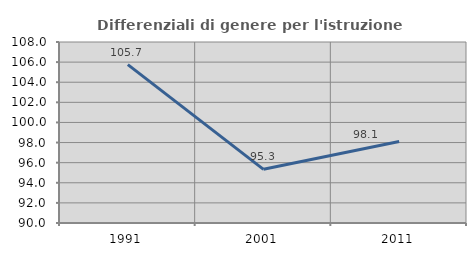
| Category | Differenziali di genere per l'istruzione superiore |
|---|---|
| 1991.0 | 105.745 |
| 2001.0 | 95.337 |
| 2011.0 | 98.11 |